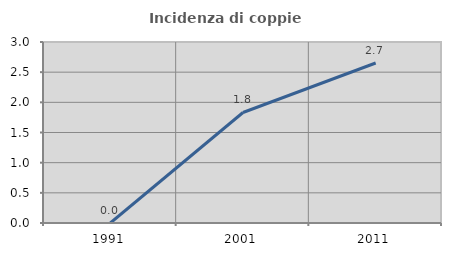
| Category | Incidenza di coppie miste |
|---|---|
| 1991.0 | 0 |
| 2001.0 | 1.832 |
| 2011.0 | 2.652 |